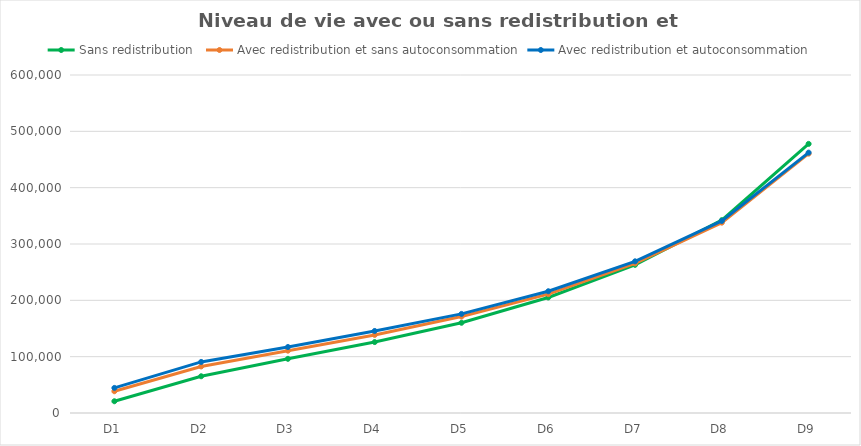
| Category | Sans redistribution  | Avec redistribution et sans autoconsommation | Avec redistribution et autoconsommation |
|---|---|---|---|
| D1 | 20853.204 | 38605 | 44518.996 |
| D2 | 65235.981 | 82653.677 | 90668.682 |
| D3 | 96189.863 | 110626.933 | 117126.605 |
| D4 | 125913.604 | 138615.597 | 145641.642 |
| D5 | 160180 | 171182.135 | 175897.341 |
| D6 | 205081.294 | 210985.867 | 216126.153 |
| D7 | 262986.922 | 265576.116 | 269235.033 |
| D8 | 342300.511 | 337889.762 | 340905.528 |
| D9 | 477736.547 | 460410.904 | 462204.259 |